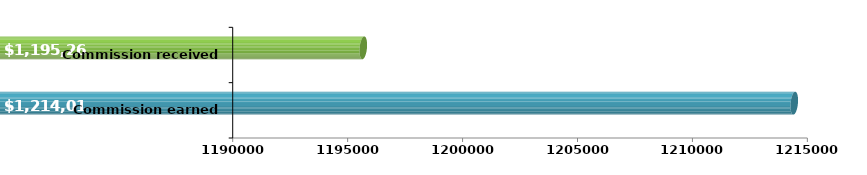
| Category | Series 0 | Series 1 | Series 2 |
|---|---|---|---|
| Commission earned YTD |  |  | 1214019 |
| Commission received YTD |  |  | 1195269 |